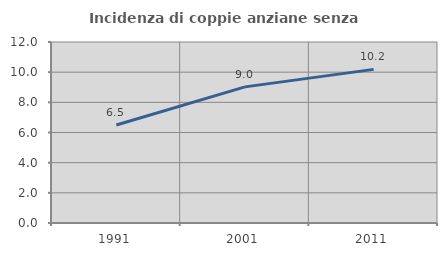
| Category | Incidenza di coppie anziane senza figli  |
|---|---|
| 1991.0 | 6.495 |
| 2001.0 | 9.024 |
| 2011.0 | 10.184 |